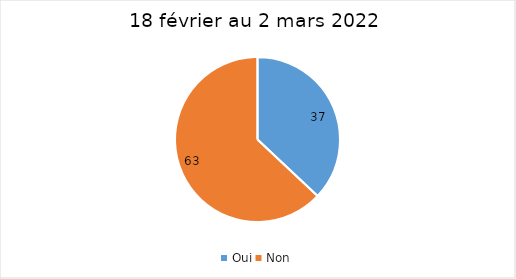
| Category | Series 0 |
|---|---|
| Oui | 37 |
| Non | 63 |